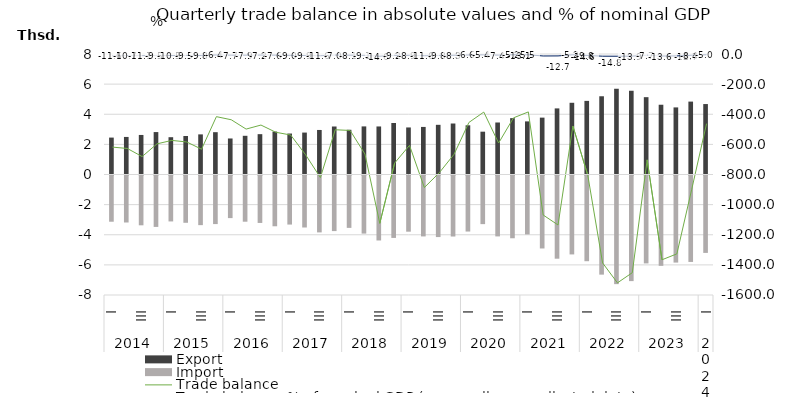
| Category | Export | Import |
|---|---|---|
| 0 | 2450.7 | -3068.8 |
| 1 | 2493.4 | -3120.5 |
| 2 | 2625.5 | -3306.5 |
| 3 | 2816.7 | -3413.2 |
| 4 | 2476.5 | -3050.1 |
| 5 | 2555.2 | -3139.2 |
| 6 | 2663.4 | -3295.5 |
| 7 | 2809.5 | -3225.4 |
| 8 | 2391.5 | -2828.1 |
| 9 | 2569.5 | -3068 |
| 10 | 2678.2 | -3149.9 |
| 11 | 2850.8 | -3370.5 |
| 12 | 2719.6 | -3257.4 |
| 13 | 2783.8 | -3452 |
| 14 | 2956.9 | -3777.4 |
| 15 | 3187 | -3690 |
| 16 | 2969.9 | -3477.4 |
| 17 | 3193.3 | -3857.4 |
| 18 | 3189.7 | -4313.9 |
| 19 | 3420.5 | -4144.2 |
| 20 | 3123.6 | -3730.2 |
| 21 | 3158.2 | -4044.8 |
| 22 | 3298.5 | -4087.5 |
| 23 | 3385.3 | -4051.1 |
| 24 | 3266.4 | -3720.9 |
| 25 | 2842.7 | -3228.3 |
| 26 | 3452.8 | -4043.7 |
| 27 | 3742.7 | -4166.6 |
| 28 | 3526.2 | -3910.7 |
| 29 | 3776 | -4844.9 |
| 30 | 4388.7 | -5523.8 |
| 31 | 4761.5 | -5239.5 |
| 32 | 4886.7 | -5690.3 |
| 33 | 5194.3 | -6581.5 |
| 34 | 5692.8 | -7212.3 |
| 35 | 5559.7 | -7011.5 |
| 36 | 5134 | -5836.8 |
| 37 | 4631.3 | -5997.4 |
| 38 | 4454.2 | -5781.1 |
| 39 | 4840.3 | -5738.6 |
| 40 | 4676.7 | -5138.9 |